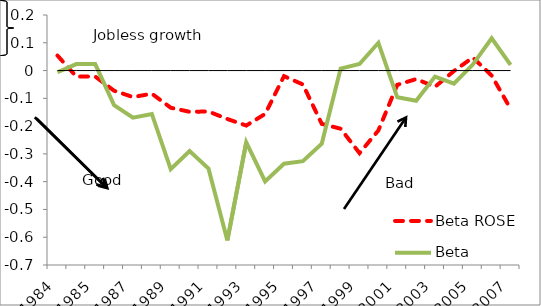
| Category | Beta ROSE | Beta Caribbean | Series 2 |
|---|---|---|---|
| 1984.0 | 0.054 | -0.006 | 0 |
| 1985.0 | -0.022 | 0.023 | 0 |
| 1985.0 | -0.022 | 0.023 | 0 |
| 1986.0 | -0.073 | -0.125 | 0 |
| 1987.0 | -0.095 | -0.17 | 0 |
| 1988.0 | -0.083 | -0.156 | 0 |
| 1989.0 | -0.134 | -0.355 | 0 |
| 1990.0 | -0.148 | -0.29 | 0 |
| 1991.0 | -0.147 | -0.353 | 0 |
| 1992.0 | -0.174 | -0.612 | 0 |
| 1993.0 | -0.198 | -0.258 | 0 |
| 1994.0 | -0.156 | -0.399 | 0 |
| 1995.0 | -0.02 | -0.335 | 0 |
| 1996.0 | -0.05 | -0.326 | 0 |
| 1997.0 | -0.192 | -0.263 | 0 |
| 1998.0 | -0.209 | 0.007 | 0 |
| 1999.0 | -0.297 | 0.024 | 0 |
| 2000.0 | -0.215 | 0.1 | 0 |
| 2001.0 | -0.051 | -0.096 | 0 |
| 2002.0 | -0.031 | -0.109 | 0 |
| 2003.0 | -0.059 | -0.022 | 0 |
| 2004.0 | -0.002 | -0.047 | 0 |
| 2005.0 | 0.047 | 0.022 | 0 |
| 2006.0 | -0.018 | 0.116 | 0 |
| 2007.0 | -0.138 | 0.021 | 0 |